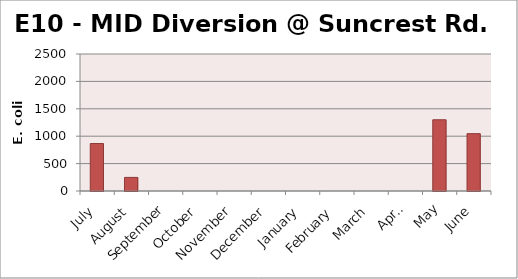
| Category | E. coli MPN |
|---|---|
| July | 866.4 |
| August | 248.1 |
| September | 0 |
| October | 0 |
| November | 0 |
| December | 0 |
| January | 0 |
| February | 0 |
| March | 0 |
| April | 0 |
| May | 1299.7 |
| June | 1046.2 |